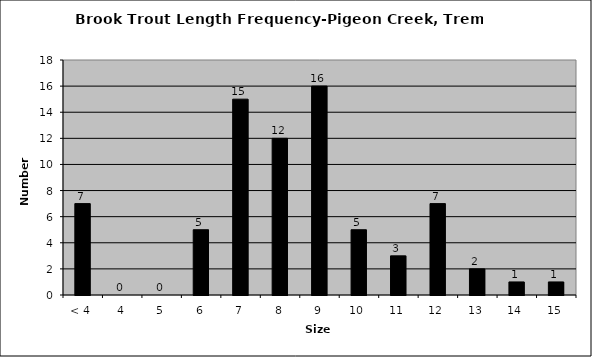
| Category | Series 0 |
|---|---|
| < 4 | 7 |
| 4 | 0 |
| 5 | 0 |
| 6 | 5 |
| 7 | 15 |
| 8 | 12 |
| 9 | 16 |
| 10 | 5 |
| 11 | 3 |
| 12 | 7 |
| 13 | 2 |
| 14 | 1 |
| 15 | 1 |